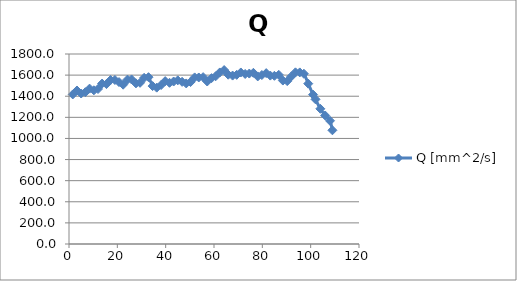
| Category | Q [mm^2/s] |
|---|---|
| 1.57 | 1416.889 |
| 3.3 | 1454.222 |
| 5.04 | 1425.778 |
| 6.78 | 1438.222 |
| 8.52 | 1472 |
| 10.3 | 1456 |
| 12.0 | 1468.444 |
| 13.7 | 1520 |
| 15.5 | 1514.667 |
| 17.2 | 1553.778 |
| 19.0 | 1553.778 |
| 20.7 | 1533.867 |
| 22.4 | 1509.333 |
| 24.2 | 1557.333 |
| 25.9 | 1559.111 |
| 27.7 | 1521.778 |
| 29.4 | 1527.111 |
| 31.1 | 1574.222 |
| 32.9 | 1580.444 |
| 34.6 | 1495.822 |
| 36.3 | 1481.422 |
| 38.1 | 1505.778 |
| 39.8 | 1543.111 |
| 41.6 | 1527.289 |
| 43.3 | 1539.2 |
| 45.0 | 1550.4 |
| 46.8 | 1536.356 |
| 48.5 | 1521.244 |
| 50.3 | 1534.4 |
| 52.0 | 1578.133 |
| 53.7 | 1577.6 |
| 55.5 | 1580.8 |
| 57.2 | 1539.378 |
| 59.0 | 1571.378 |
| 60.7 | 1589.333 |
| 62.4 | 1625.244 |
| 64.2 | 1647.822 |
| 65.9 | 1603.733 |
| 67.7 | 1595.556 |
| 69.4 | 1602.667 |
| 71.1 | 1624.889 |
| 72.9 | 1610.844 |
| 74.6 | 1614.756 |
| 76.3 | 1621.689 |
| 78.1 | 1587.556 |
| 79.8 | 1600.711 |
| 81.6 | 1618.844 |
| 83.3 | 1595.378 |
| 85.0 | 1593.244 |
| 86.8 | 1602.667 |
| 88.5 | 1548.444 |
| 90.3 | 1543.111 |
| 92.0 | 1587.556 |
| 93.7 | 1626.311 |
| 95.5 | 1625.6 |
| 97.2 | 1612.8 |
| 99.0 | 1518.933 |
| 101.0 | 1414.933 |
| 102.0 | 1370.667 |
| 104.0 | 1280.889 |
| 106.0 | 1217.778 |
| 108.0 | 1167.467 |
| 109.0 | 1077.333 |